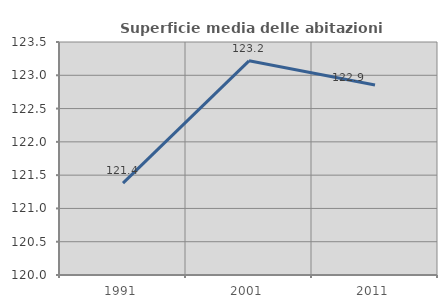
| Category | Superficie media delle abitazioni occupate |
|---|---|
| 1991.0 | 121.379 |
| 2001.0 | 123.217 |
| 2011.0 | 122.854 |